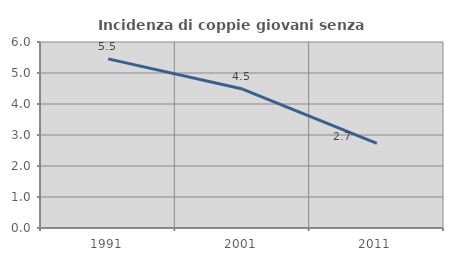
| Category | Incidenza di coppie giovani senza figli |
|---|---|
| 1991.0 | 5.456 |
| 2001.0 | 4.482 |
| 2011.0 | 2.73 |